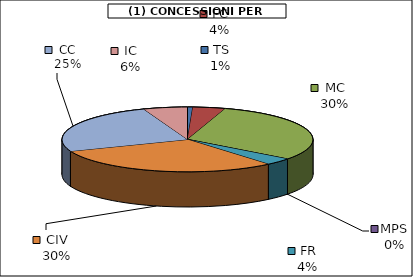
| Category | Series 0 |
|---|---|
| TS | 360 |
| FC | 2220 |
| MC | 16080 |
| MPS | 0 |
| FR | 1864 |
| CIV | 15981 |
| CC | 13311.75 |
| IC | 3000 |